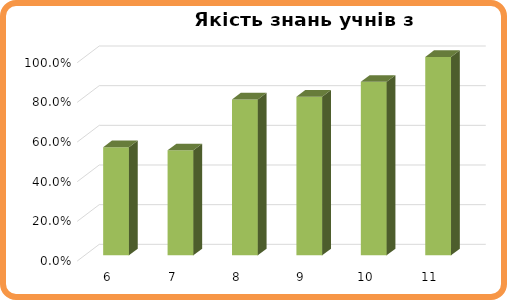
| Category | Series 0 |
|---|---|
| 6.0 | 0.545 |
| 7.0 | 0.529 |
| 8.0 | 0.786 |
| 9.0 | 0.8 |
| 10.0 | 0.875 |
| 11.0 | 1 |